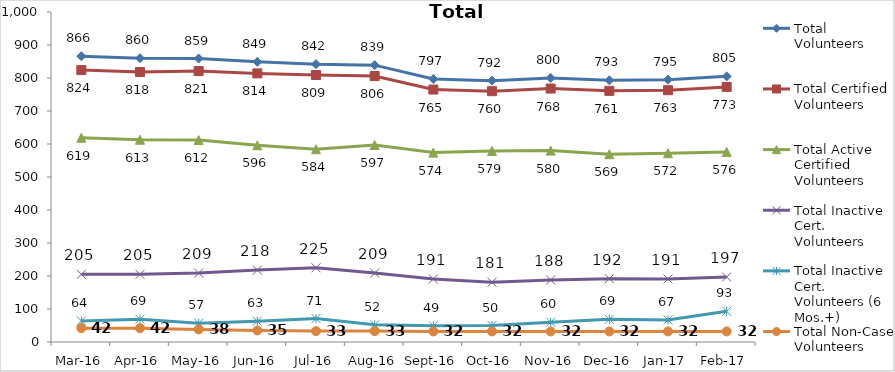
| Category | Total Volunteers | Total Certified Volunteers | Total Active Certified Volunteers | Total Inactive Cert. Volunteers | Total Inactive Cert. Volunteers (6 Mos.+) | Total Non-Case Volunteers |
|---|---|---|---|---|---|---|
| Mar-16 | 866 | 824 | 619 | 205 | 64 | 42 |
| Apr-16 | 860 | 818 | 613 | 205 | 69 | 42 |
| May-16 | 859 | 821 | 612 | 209 | 57 | 38 |
| Jun-16 | 849 | 814 | 596 | 218 | 63 | 35 |
| Jul-16 | 842 | 809 | 584 | 225 | 71 | 33 |
| Aug-16 | 839 | 806 | 597 | 209 | 52 | 33 |
| Sep-16 | 797 | 765 | 574 | 191 | 49 | 32 |
| Oct-16 | 792 | 760 | 579 | 181 | 50 | 32 |
| Nov-16 | 800 | 768 | 580 | 188 | 60 | 32 |
| Dec-16 | 793 | 761 | 569 | 192 | 69 | 32 |
| Jan-17 | 795 | 763 | 572 | 191 | 67 | 32 |
| Feb-17 | 805 | 773 | 576 | 197 | 93 | 32 |